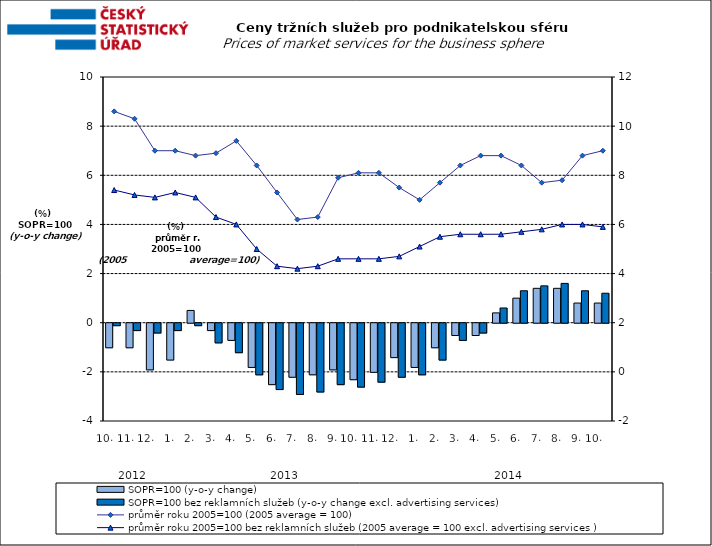
| Category | SOPR=100 (y-o-y change)   | SOPR=100 bez reklamních služeb (y-o-y change excl. advertising services)   |
|---|---|---|
| 0 | -1 | -0.1 |
| 1 | -1 | -0.3 |
| 2 | -1.9 | -0.4 |
| 3 | -1.5 | -0.3 |
| 4 | 0.5 | -0.1 |
| 5 | -0.3 | -0.8 |
| 6 | -0.7 | -1.2 |
| 7 | -1.8 | -2.1 |
| 8 | -2.5 | -2.7 |
| 9 | -2.2 | -2.9 |
| 10 | -2.1 | -2.8 |
| 11 | -1.9 | -2.5 |
| 12 | -2.3 | -2.6 |
| 13 | -2 | -2.4 |
| 14 | -1.4 | -2.2 |
| 15 | -1.8 | -2.1 |
| 16 | -1 | -1.5 |
| 17 | -0.5 | -0.7 |
| 18 | -0.5 | -0.4 |
| 19 | 0.4 | 0.6 |
| 20 | 1 | 1.3 |
| 21 | 1.4 | 1.5 |
| 22 | 1.4 | 1.6 |
| 23 | 0.8 | 1.3 |
| 24 | 0.8 | 1.2 |